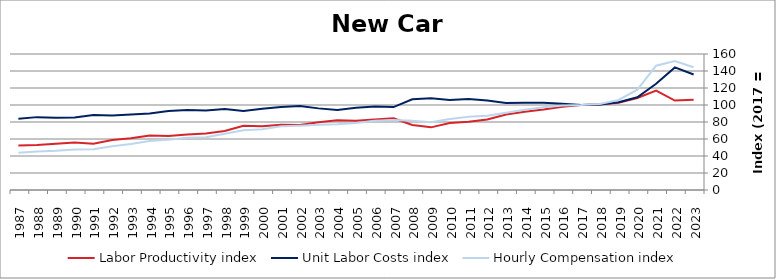
| Category | Labor Productivity index | Unit Labor Costs index | Hourly Compensation index |
|---|---|---|---|
| 2023.0 | 106.281 | 135.911 | 144.448 |
| 2022.0 | 105.21 | 144.237 | 151.751 |
| 2021.0 | 117.058 | 124.931 | 146.242 |
| 2020.0 | 108.261 | 109.048 | 118.056 |
| 2019.0 | 102.654 | 103.15 | 105.887 |
| 2018.0 | 100.477 | 100.689 | 101.169 |
| 2017.0 | 100 | 100 | 100 |
| 2016.0 | 98.044 | 101.329 | 99.347 |
| 2015.0 | 94.758 | 102.74 | 97.354 |
| 2014.0 | 91.974 | 102.57 | 94.338 |
| 2013.0 | 88.822 | 102.293 | 90.859 |
| 2012.0 | 83.038 | 105.165 | 87.327 |
| 2011.0 | 80.39 | 107.024 | 86.036 |
| 2010.0 | 78.926 | 105.957 | 83.627 |
| 2009.0 | 73.704 | 108.025 | 79.619 |
| 2008.0 | 76.443 | 106.763 | 81.612 |
| 2007.0 | 84.414 | 97.584 | 82.375 |
| 2006.0 | 82.853 | 98.214 | 81.374 |
| 2005.0 | 81.453 | 96.858 | 78.894 |
| 2004.0 | 82.081 | 94.116 | 77.252 |
| 2003.0 | 79.805 | 96.031 | 76.638 |
| 2002.0 | 76.537 | 98.87 | 75.672 |
| 2001.0 | 76.778 | 97.693 | 75.007 |
| 2000.0 | 74.938 | 95.462 | 71.537 |
| 1999.0 | 75.609 | 93.068 | 70.368 |
| 1998.0 | 69.505 | 95.339 | 66.265 |
| 1997.0 | 66.479 | 93.544 | 62.187 |
| 1996.0 | 65.179 | 94.159 | 61.372 |
| 1995.0 | 63.391 | 93.058 | 58.99 |
| 1994.0 | 64.102 | 89.945 | 57.657 |
| 1993.0 | 61.012 | 88.769 | 54.159 |
| 1992.0 | 58.755 | 87.774 | 51.572 |
| 1991.0 | 54.371 | 88.349 | 48.036 |
| 1990.0 | 55.886 | 85.352 | 47.7 |
| 1989.0 | 54.378 | 85.037 | 46.242 |
| 1988.0 | 52.838 | 85.733 | 45.299 |
| 1987.0 | 52.211 | 83.876 | 43.793 |